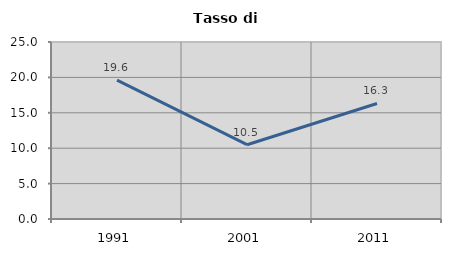
| Category | Tasso di disoccupazione   |
|---|---|
| 1991.0 | 19.617 |
| 2001.0 | 10.493 |
| 2011.0 | 16.316 |